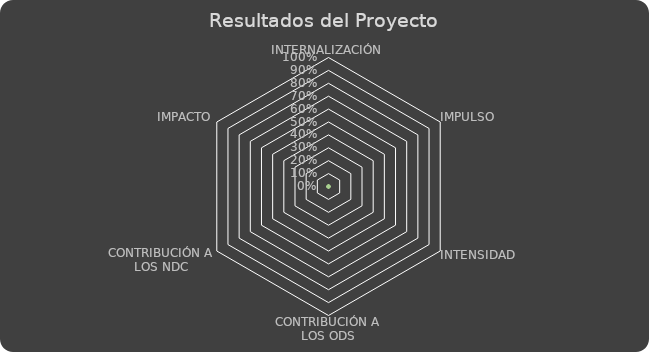
| Category | Series 0 |
|---|---|
| INTERNALIZACIÓN | 0 |
| IMPULSO | 0 |
| INTENSIDAD | 0 |
| CONTRIBUCIÓN A LOS ODS | 0 |
| CONTRIBUCIÓN A LOS NDC | 0 |
| IMPACTO | 0 |